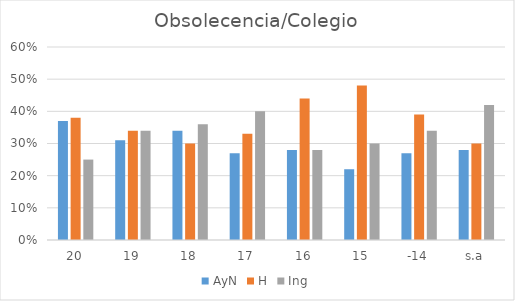
| Category | AyN | H | Ing |
|---|---|---|---|
| 20 | 0.37 | 0.38 | 0.25 |
| 19 | 0.31 | 0.34 | 0.34 |
| 18 | 0.34 | 0.3 | 0.36 |
| 17 | 0.27 | 0.33 | 0.4 |
| 16 | 0.28 | 0.44 | 0.28 |
| 15 | 0.22 | 0.48 | 0.3 |
| -14 | 0.27 | 0.39 | 0.34 |
| s.a | 0.28 | 0.3 | 0.42 |